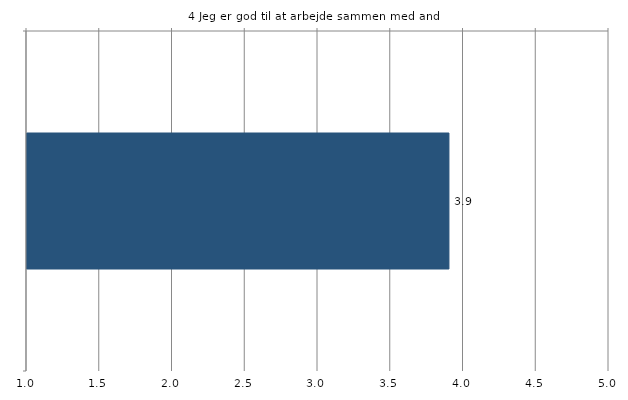
| Category | Gns. |
|---|---|
|   | 3.9 |